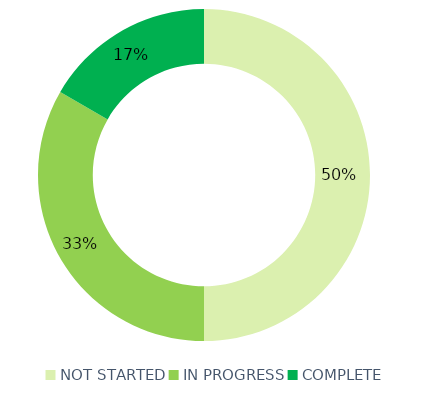
| Category | Series 0 |
|---|---|
| NOT STARTED | 3 |
| IN PROGRESS | 2 |
| COMPLETE | 1 |